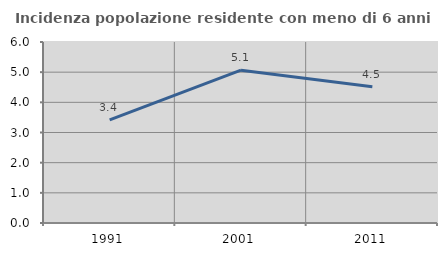
| Category | Incidenza popolazione residente con meno di 6 anni |
|---|---|
| 1991.0 | 3.418 |
| 2001.0 | 5.065 |
| 2011.0 | 4.516 |